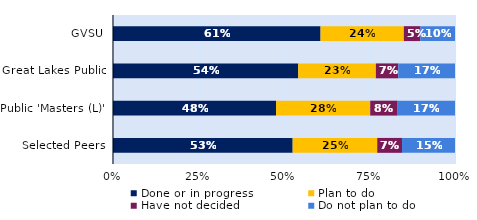
| Category | Done or in progress | Plan to do | Have not decided | Do not plan to do |
|---|---|---|---|---|
| GVSU | 0.607 | 0.244 | 0.049 | 0.101 |
| Great Lakes Public | 0.542 | 0.227 | 0.066 | 0.166 |
| Public 'Masters (L)' | 0.477 | 0.275 | 0.08 | 0.168 |
| Selected Peers | 0.525 | 0.247 | 0.073 | 0.155 |